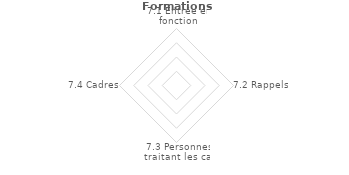
| Category | Series 2 |
|---|---|
| 7.1 Entrée en fonction | 0 |
| 7.2 Rappels | 0 |
| 7.3 Personnes traitant les cas | 0 |
| 7.4 Cadres | 0 |